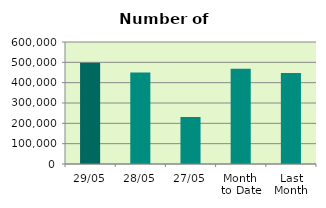
| Category | Series 0 |
|---|---|
| 29/05 | 497446 |
| 28/05 | 450422 |
| 27/05 | 230648 |
| Month 
to Date | 468131.5 |
| Last
Month | 447135.9 |